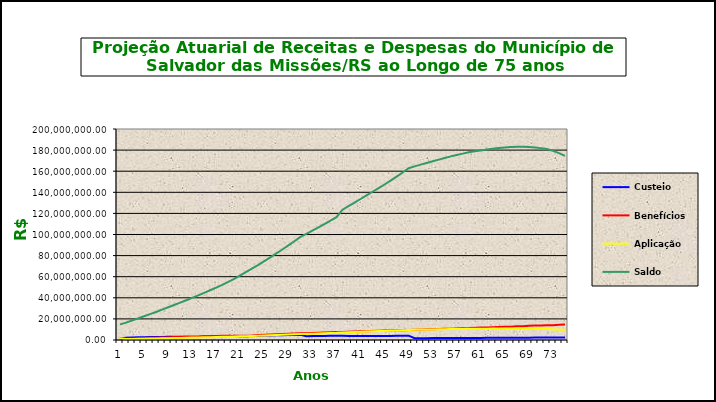
| Category | Custeio | Benefícios | Aplicação | Saldo |
|---|---|---|---|---|
| 0 | 1409934.28 | 918363.1 | 1633804.29 | 14838034.31 |
| 1 | 2038176.162 | 1289172.668 | 890282.059 | 16477319.862 |
| 2 | 2380119.773 | 1367563.883 | 988639.192 | 18478514.944 |
| 3 | 2490376.164 | 1570272.568 | 1108710.897 | 20507329.437 |
| 4 | 2681431.215 | 1964521.723 | 1230439.766 | 22454678.695 |
| 5 | 2745232.989 | 2054937.87 | 1347280.722 | 24492254.536 |
| 6 | 2837091.235 | 2211294.244 | 1469535.272 | 26587586.799 |
| 7 | 2930985.711 | 2371625.829 | 1595255.208 | 28742201.888 |
| 8 | 2999406.639 | 2470420.938 | 1724532.113 | 30995719.701 |
| 9 | 3180909.018 | 2837560.031 | 1859743.182 | 33198811.87 |
| 10 | 3084560.772 | 2809844.083 | 1991928.712 | 35465457.271 |
| 11 | 3083369.382 | 3054339.822 | 2127927.436 | 37622414.268 |
| 12 | 3126374.896 | 3097100.579 | 2257344.856 | 39909033.441 |
| 13 | 3169982.487 | 3140459.987 | 2394542.006 | 42333097.947 |
| 14 | 3311166.657 | 3469620.761 | 2539985.877 | 44714629.72 |
| 15 | 3406523.132 | 3662788.979 | 2682877.783 | 47141241.656 |
| 16 | 3503902.863 | 3860685.861 | 2828474.499 | 49612933.157 |
| 17 | 3626615.199 | 4013798.319 | 2976775.989 | 52202526.027 |
| 18 | 3690790.732 | 3994615.559 | 3132151.562 | 55030852.762 |
| 19 | 3675043.823 | 3974108.977 | 3301851.166 | 58033638.774 |
| 20 | 3659684.893 | 3952245.266 | 3482018.326 | 61223096.727 |
| 21 | 3670683.057 | 4007576.7 | 3673385.804 | 64559588.888 |
| 22 | 3732273.47 | 4223055.696 | 3873575.333 | 67942381.995 |
| 23 | 3866785.067 | 4686188.835 | 4076542.92 | 71199521.147 |
| 24 | 4168183.53 | 4915662.08 | 4271971.269 | 74724013.866 |
| 25 | 4284532.699 | 5150642.084 | 4483440.832 | 78341345.313 |
| 26 | 4403324.943 | 5391238.057 | 4700480.719 | 82053912.918 |
| 27 | 4554503.881 | 5722984.093 | 4923234.775 | 85808667.481 |
| 28 | 4678738.453 | 5976343.514 | 5148520.049 | 89659582.469 |
| 29 | 4805561.173 | 6235675.294 | 5379574.948 | 93609043.297 |
| 30 | 4914217.928 | 6441662.049 | 5616542.598 | 97698141.773 |
| 31 | 3634126.287 | 6622153.3 | 5861888.506 | 100572003.266 |
| 32 | 3684842.398 | 6714863.446 | 6034320.196 | 103576302.414 |
| 33 | 3768767.541 | 6901725.84 | 6214578.145 | 106657922.26 |
| 34 | 3854322.621 | 7092504.267 | 6399475.336 | 109819215.949 |
| 35 | 3941536.829 | 7287271.753 | 6589152.957 | 113062633.983 |
| 36 | 4030439.851 | 7486102.597 | 6783758.039 | 116390729.276 |
| 37 | 4143756.555 | 7697180.746 | 7192198.161 | 123508743.321 |
| 38 | 3841640.087 | 7905873.485 | 7410524.599 | 126855034.523 |
| 39 | 3815095.834 | 8016555.714 | 7611302.071 | 130264876.714 |
| 40 | 3816115.509 | 8232565.587 | 7815892.603 | 133664319.239 |
| 41 | 3795352.625 | 8382826.583 | 8019859.154 | 137096704.435 |
| 42 | 3791067.139 | 8606890.376 | 8225802.266 | 140506683.465 |
| 43 | 3783756.073 | 8835584.92 | 8430401.008 | 143885255.625 |
| 44 | 3836567 | 8959283.109 | 8633115.338 | 147395654.854 |
| 45 | 3890117.281 | 9084713.073 | 8843739.291 | 151044798.353 |
| 46 | 3944417.265 | 9211899.056 | 9062687.901 | 154840004.463 |
| 47 | 3999477.449 | 9340865.642 | 9290400.268 | 158789016.537 |
| 48 | 4084305.226 | 9587624.764 | 9527340.992 | 162813037.991 |
| 49 | 1710860.964 | 9721851.511 | 9768782.279 | 164570829.723 |
| 50 | 1734651.36 | 9977214.805 | 9874249.783 | 166202516.062 |
| 51 | 1758774.821 | 10116895.812 | 9972150.964 | 167816546.034 |
| 52 | 1783236.011 | 10258532.353 | 10068992.762 | 169410242.454 |
| 53 | 1808039.657 | 10402151.806 | 10164614.547 | 170980744.852 |
| 54 | 1833190.555 | 10547781.932 | 10258844.691 | 172524998.166 |
| 55 | 1858693.565 | 10695450.879 | 10351499.89 | 174039740.742 |
| 56 | 1884553.617 | 10974819.413 | 10442384.445 | 175391859.39 |
| 57 | 1910775.71 | 11172192.743 | 10523511.563 | 176653953.921 |
| 58 | 1937364.912 | 11328603.441 | 10599237.235 | 177861952.628 |
| 59 | 1964326.363 | 11622357.244 | 10671717.158 | 178875638.904 |
| 60 | 1991665.275 | 11922115.748 | 10732538.334 | 179677726.765 |
| 61 | 2019386.931 | 11950061.229 | 10780663.606 | 180527716.073 |
| 62 | 2047496.69 | 12117362.086 | 10831662.964 | 181289513.641 |
| 63 | 2075999.986 | 12287005.156 | 10877370.818 | 181955879.29 |
| 64 | 2104902.328 | 12459023.228 | 10917352.757 | 182519111.148 |
| 65 | 2134209.303 | 12633449.553 | 10951146.669 | 182971017.567 |
| 66 | 2163926.576 | 12959285.685 | 10978261.054 | 183153919.512 |
| 67 | 2194059.89 | 13140715.685 | 10989235.171 | 183196498.888 |
| 68 | 2224615.071 | 13477853.84 | 10991789.933 | 182935050.051 |
| 69 | 2255598.024 | 13666543.794 | 10976103.003 | 182500207.285 |
| 70 | 2287014.739 | 13857875.407 | 10950012.437 | 181879359.054 |
| 71 | 2318871.287 | 14051885.663 | 10912761.543 | 181059106.221 |
| 72 | 2351173.828 | 14086684.698 | 9958250.842 | 179281846.193 |
| 73 | 2383928.604 | 14448092.631 | 9860501.541 | 177078183.707 |
| 74 | 2417141.946 | 14650365.928 | 9739300.104 | 174584259.829 |